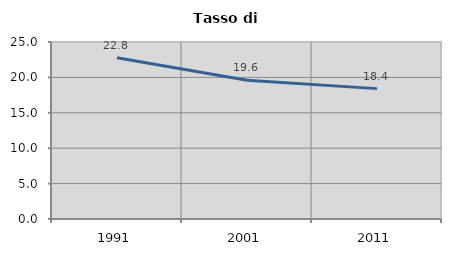
| Category | Tasso di disoccupazione   |
|---|---|
| 1991.0 | 22.769 |
| 2001.0 | 19.609 |
| 2011.0 | 18.414 |